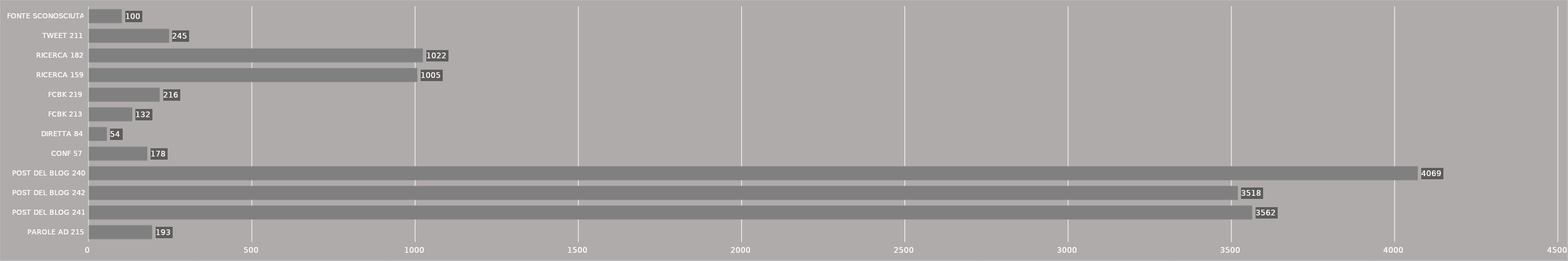
| Category | Series 0 |
|---|---|
| PAROLE AD 215 | 193 |
| POST DEL BLOG 241 | 3562 |
| POST DEL BLOG 242 | 3518 |
| POST DEL BLOG 240 | 4069 |
| CONF 57 | 178 |
| DIRETTA 84 | 54 |
| FCBK 213 | 132 |
| FCBK 219 | 216 |
| RICERCA 159 | 1005 |
| RICERCA 182 | 1022 |
| TWEET 211 | 245 |
| FONTE SCONOSCIUTA | 100 |